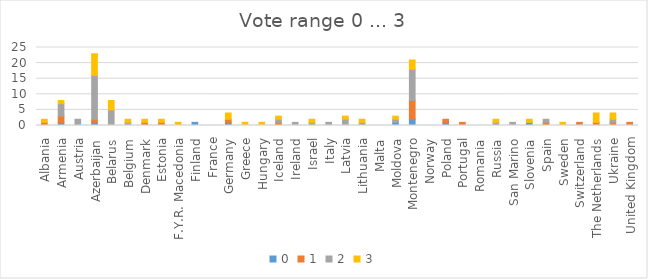
| Category | 0 | 1 | 2 | 3 |
|---|---|---|---|---|
| Albania | 0 | 1 | 0 | 1 |
| Armenia | 1 | 2 | 4 | 1 |
| Austria | 0 | 0 | 2 | 0 |
| Azerbaijan | 1 | 1 | 14 | 7 |
| Belarus | 0 | 0 | 5 | 3 |
| Belgium | 0 | 0 | 1 | 1 |
| Denmark | 0 | 1 | 0 | 1 |
| Estonia | 0 | 1 | 0 | 1 |
| F.Y.R. Macedonia | 0 | 0 | 0 | 1 |
| Finland | 1 | 0 | 0 | 0 |
| France | 0 | 0 | 0 | 0 |
| Germany | 1 | 1 | 0 | 2 |
| Greece | 0 | 0 | 0 | 1 |
| Hungary | 0 | 0 | 0 | 1 |
| Iceland | 0 | 1 | 1 | 1 |
| Ireland | 0 | 0 | 1 | 0 |
| Israel | 0 | 0 | 1 | 1 |
| Italy | 0 | 0 | 1 | 0 |
| Latvia | 0 | 0 | 2 | 1 |
| Lithuania | 0 | 0 | 1 | 1 |
| Malta | 0 | 0 | 0 | 0 |
| Moldova | 1 | 0 | 1 | 1 |
| Montenegro | 2 | 6 | 10 | 3 |
| Norway | 0 | 0 | 0 | 0 |
| Poland | 1 | 1 | 0 | 0 |
| Portugal | 0 | 1 | 0 | 0 |
| Romania | 0 | 0 | 0 | 0 |
| Russia | 0 | 0 | 1 | 1 |
| San Marino | 0 | 0 | 1 | 0 |
| Slovenia | 1 | 0 | 0 | 1 |
| Spain | 0 | 1 | 1 | 0 |
| Sweden | 0 | 0 | 0 | 1 |
| Switzerland | 0 | 1 | 0 | 0 |
| The Netherlands | 0 | 1 | 0 | 3 |
| Ukraine | 0 | 1 | 1 | 2 |
| United Kingdom | 0 | 1 | 0 | 0 |